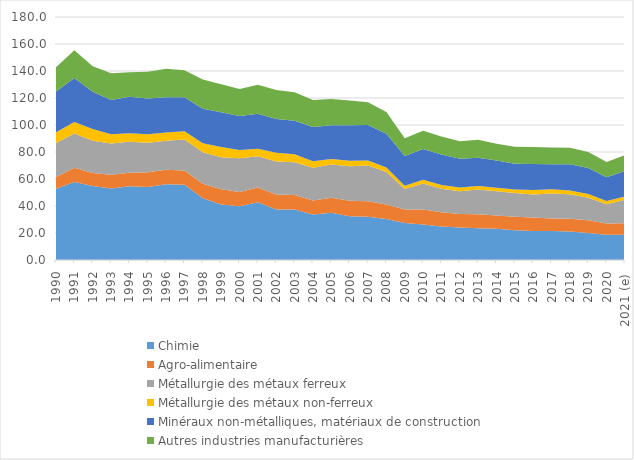
| Category | Chimie | Agro-alimentaire | Métallurgie des métaux ferreux | Métallurgie des métaux non-ferreux | Minéraux non-métalliques, matériaux de construction | Autres industries manufacturières |
|---|---|---|---|---|---|---|
| 1990 | 52.734 | 8.662 | 25.264 | 7.977 | 30.14 | 18.034 |
| 1991 | 57.807 | 10.594 | 25.341 | 8.554 | 32.556 | 20.517 |
| 1992 | 54.814 | 9.685 | 23.877 | 8.602 | 27.62 | 18.846 |
| 1993 | 52.991 | 10.111 | 23.142 | 6.853 | 25.497 | 19.803 |
| 1994 | 54.589 | 10.099 | 22.834 | 6.411 | 27.08 | 18.152 |
| 1995 | 54.071 | 10.891 | 21.914 | 6.269 | 26.576 | 19.787 |
| 1996 | 56.054 | 10.83 | 21.396 | 6.168 | 26.19 | 21.117 |
| 1997 | 55.685 | 10.669 | 22.893 | 6.141 | 25.099 | 20.01 |
| 1998 | 45.807 | 10.745 | 23.196 | 6.653 | 25.643 | 21.707 |
| 1999 | 41.11 | 11.273 | 23.746 | 7.545 | 25.696 | 20.822 |
| 2000 | 39.785 | 10.535 | 25.031 | 6.087 | 25.256 | 19.945 |
| 2001 | 42.688 | 11.017 | 23.092 | 5.519 | 26.076 | 21.499 |
| 2002 | 37.395 | 11.058 | 24.444 | 6.637 | 24.869 | 21.439 |
| 2003 | 37.415 | 10.818 | 24.149 | 5.991 | 24.731 | 21.221 |
| 2004 | 33.733 | 10.363 | 24.25 | 4.74 | 25.41 | 20.063 |
| 2005 | 34.976 | 11.133 | 24.714 | 3.918 | 25.133 | 19.358 |
| 2006 | 32.456 | 11.355 | 25.55 | 4.096 | 26.318 | 18.369 |
| 2007 | 32.017 | 11.452 | 26.442 | 3.741 | 26.424 | 16.774 |
| 2008 | 30.37 | 10.811 | 24.038 | 3.248 | 25.128 | 15.982 |
| 2009 | 27.409 | 10.011 | 15.117 | 2.54 | 22.027 | 13.063 |
| 2010 | 26.277 | 11.137 | 19.181 | 2.855 | 22.797 | 13.539 |
| 2011 | 24.768 | 10.554 | 17.492 | 2.799 | 22.584 | 13.319 |
| 2012 | 23.989 | 10.07 | 16.834 | 2.836 | 21.274 | 12.985 |
| 2013 | 23.603 | 10.257 | 18.353 | 2.636 | 20.823 | 13.397 |
| 2014 | 23.072 | 9.978 | 17.921 | 2.587 | 20.228 | 12.362 |
| 2015 | 22.122 | 9.865 | 17.551 | 2.663 | 19.119 | 12.515 |
| 2016 | 21.549 | 9.939 | 17.105 | 3.191 | 19.34 | 12.562 |
| 2017 | 21.464 | 9.34 | 18.462 | 3.071 | 18.613 | 12.476 |
| 2018 | 21.044 | 9.427 | 18.221 | 2.782 | 19.4 | 12.196 |
| 2019 | 20.047 | 9.322 | 16.773 | 2.674 | 19.421 | 11.848 |
| 2020 | 18.667 | 8.295 | 14.354 | 2.362 | 17.698 | 11.131 |
| 2021 (e)  | 18.662 | 8.545 | 17.391 | 2.455 | 19.027 | 11.674 |